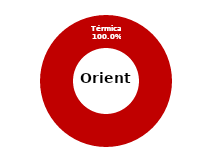
| Category | Oriente |
|---|---|
| Eólica | 0 |
| Hidráulica | 0 |
| Solar | 0 |
| Térmica | 32.74 |